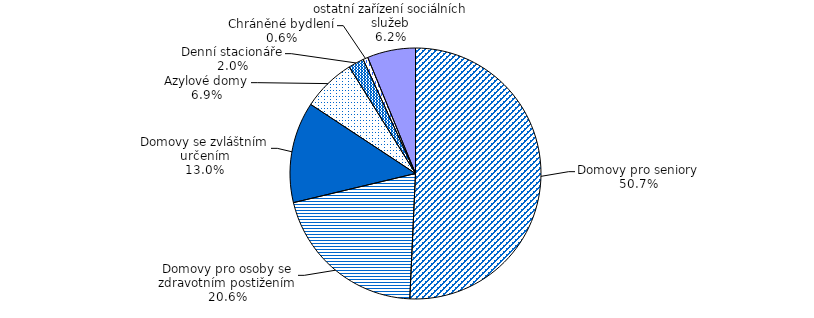
| Category | Series 0 |
|---|---|
| Domovy pro seniory | 2800 |
| Domovy pro osoby se zdravotním postižením | 1134 |
| Domovy se zvláštním určením | 718 |
| Azylové domy | 379 |
| Denní stacionáře | 111 |
| Chráněné bydlení | 35 |
| ostatní zařízení sociálních služeb | 343 |